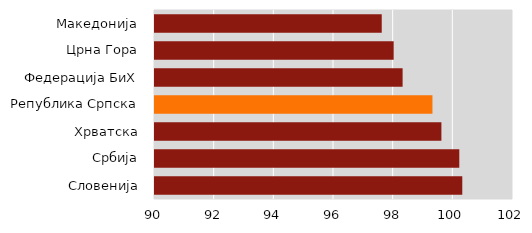
| Category | Series 0 |
|---|---|
| Словенија | 100.3 |
| Србија | 100.2 |
| Хрватска | 99.6 |
| Република Српска | 99.3 |
| Федерација БиХ | 98.3 |
| Црна Гора | 98 |
| Македонија | 97.6 |